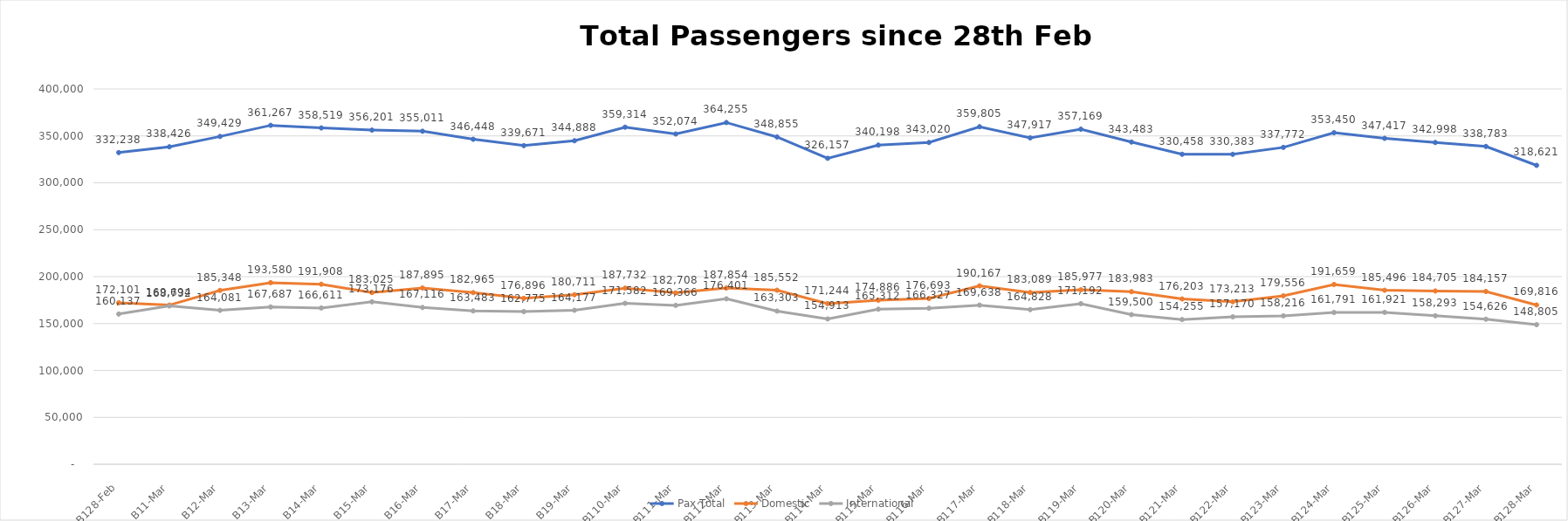
| Category | Pax Total |  Domestic  |  International  |
|---|---|---|---|
| 2023-02-28 | 332238 | 172101 | 160137 |
| 2023-03-01 | 338426 | 169694 | 168732 |
| 2023-03-02 | 349429 | 185348 | 164081 |
| 2023-03-03 | 361267 | 193580 | 167687 |
| 2023-03-04 | 358519 | 191908 | 166611 |
| 2023-03-05 | 356201 | 183025 | 173176 |
| 2023-03-06 | 355011 | 187895 | 167116 |
| 2023-03-07 | 346448 | 182965 | 163483 |
| 2023-03-08 | 339671 | 176896 | 162775 |
| 2023-03-09 | 344888 | 180711 | 164177 |
| 2023-03-10 | 359314 | 187732 | 171582 |
| 2023-03-11 | 352074 | 182708 | 169366 |
| 2023-03-12 | 364255 | 187854 | 176401 |
| 2023-03-13 | 348855 | 185552 | 163303 |
| 2023-03-14 | 326157 | 171244 | 154913 |
| 2023-03-15 | 340198 | 174886 | 165312 |
| 2023-03-16 | 343020 | 176693 | 166327 |
| 2023-03-17 | 359805 | 190167 | 169638 |
| 2023-03-18 | 347917 | 183089 | 164828 |
| 2023-03-19 | 357169 | 185977 | 171192 |
| 2023-03-20 | 343483 | 183983 | 159500 |
| 2023-03-21 | 330458 | 176203 | 154255 |
| 2023-03-22 | 330383 | 173213 | 157170 |
| 2023-03-23 | 337772 | 179556 | 158216 |
| 2023-03-24 | 353450 | 191659 | 161791 |
| 2023-03-25 | 347417 | 185496 | 161921 |
| 2023-03-26 | 342998 | 184705 | 158293 |
| 2023-03-27 | 338783 | 184157 | 154626 |
| 2023-03-28 | 318621 | 169816 | 148805 |